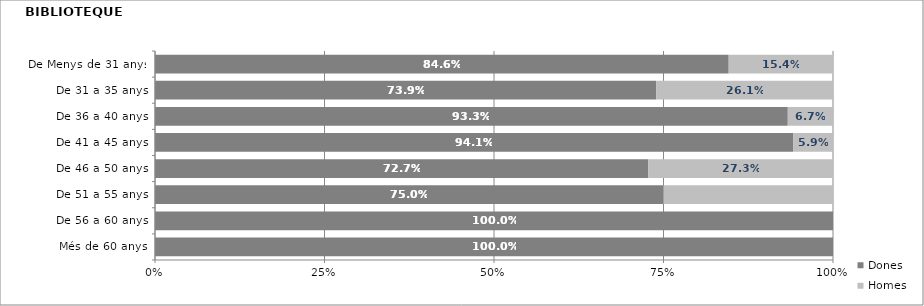
| Category | Dones | Homes |
|---|---|---|
| Més de 60 anys | 1 | 0 |
| De 56 a 60 anys | 1 | 0 |
| De 51 a 55 anys | 0.75 | 0.25 |
| De 46 a 50 anys | 0.727 | 0.273 |
| De 41 a 45 anys | 0.941 | 0.059 |
| De 36 a 40 anys | 0.933 | 0.067 |
| De 31 a 35 anys | 0.739 | 0.261 |
| De Menys de 31 anys | 0.846 | 0.154 |